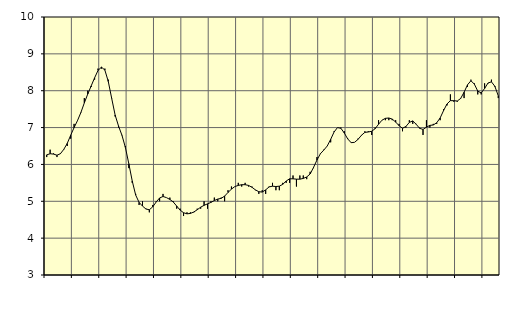
| Category | Piggar | Byggverksamhet, SNI 41-43 |
|---|---|---|
| nan | 6.2 | 6.26 |
| 87.0 | 6.4 | 6.29 |
| 87.0 | 6.3 | 6.28 |
| 87.0 | 6.2 | 6.25 |
| nan | 6.3 | 6.29 |
| 88.0 | 6.4 | 6.41 |
| 88.0 | 6.5 | 6.57 |
| 88.0 | 6.7 | 6.79 |
| nan | 7.1 | 7 |
| 89.0 | 7.2 | 7.19 |
| 89.0 | 7.4 | 7.41 |
| 89.0 | 7.8 | 7.67 |
| nan | 8 | 7.91 |
| 90.0 | 8.1 | 8.13 |
| 90.0 | 8.3 | 8.35 |
| 90.0 | 8.6 | 8.55 |
| nan | 8.6 | 8.64 |
| 91.0 | 8.6 | 8.56 |
| 91.0 | 8.3 | 8.25 |
| 91.0 | 7.8 | 7.79 |
| nan | 7.3 | 7.34 |
| 92.0 | 7 | 7.04 |
| 92.0 | 6.8 | 6.79 |
| 92.0 | 6.5 | 6.46 |
| nan | 5.9 | 6.02 |
| 93.0 | 5.5 | 5.55 |
| 93.0 | 5.2 | 5.17 |
| 93.0 | 4.9 | 4.97 |
| nan | 5 | 4.87 |
| 94.0 | 4.8 | 4.79 |
| 94.0 | 4.7 | 4.77 |
| 94.0 | 4.9 | 4.85 |
| nan | 5 | 4.98 |
| 95.0 | 5 | 5.09 |
| 95.0 | 5.2 | 5.13 |
| 95.0 | 5.1 | 5.1 |
| nan | 5.1 | 5.05 |
| 96.0 | 5 | 4.98 |
| 96.0 | 4.8 | 4.87 |
| 96.0 | 4.8 | 4.76 |
| nan | 4.6 | 4.69 |
| 97.0 | 4.7 | 4.66 |
| 97.0 | 4.7 | 4.67 |
| 97.0 | 4.7 | 4.71 |
| nan | 4.8 | 4.77 |
| 98.0 | 4.8 | 4.84 |
| 98.0 | 5 | 4.89 |
| 98.0 | 4.8 | 4.93 |
| nan | 5 | 4.97 |
| 99.0 | 5.1 | 5.02 |
| 99.0 | 5 | 5.06 |
| 99.0 | 5.1 | 5.08 |
| nan | 5 | 5.14 |
| 0.0 | 5.3 | 5.24 |
| 0.0 | 5.4 | 5.33 |
| 0.0 | 5.4 | 5.4 |
| nan | 5.5 | 5.43 |
| 1.0 | 5.4 | 5.45 |
| 1.0 | 5.5 | 5.45 |
| 1.0 | 5.4 | 5.43 |
| nan | 5.4 | 5.38 |
| 2.0 | 5.3 | 5.31 |
| 2.0 | 5.2 | 5.26 |
| 2.0 | 5.3 | 5.25 |
| nan | 5.2 | 5.31 |
| 3.0 | 5.4 | 5.39 |
| 3.0 | 5.5 | 5.41 |
| 3.0 | 5.3 | 5.4 |
| nan | 5.3 | 5.41 |
| 4.0 | 5.5 | 5.46 |
| 4.0 | 5.5 | 5.55 |
| 4.0 | 5.5 | 5.61 |
| nan | 5.7 | 5.61 |
| 5.0 | 5.4 | 5.6 |
| 5.0 | 5.7 | 5.6 |
| 5.0 | 5.7 | 5.62 |
| nan | 5.6 | 5.66 |
| 6.0 | 5.8 | 5.74 |
| 6.0 | 5.9 | 5.92 |
| 6.0 | 6.2 | 6.12 |
| nan | 6.3 | 6.29 |
| 7.0 | 6.4 | 6.39 |
| 7.0 | 6.5 | 6.5 |
| 7.0 | 6.6 | 6.68 |
| nan | 6.9 | 6.88 |
| 8.0 | 7 | 7 |
| 8.0 | 7 | 6.98 |
| 8.0 | 6.9 | 6.85 |
| nan | 6.7 | 6.69 |
| 9.0 | 6.6 | 6.59 |
| 9.0 | 6.6 | 6.6 |
| 9.0 | 6.7 | 6.68 |
| nan | 6.8 | 6.79 |
| 10.0 | 6.9 | 6.87 |
| 10.0 | 6.9 | 6.88 |
| 10.0 | 6.8 | 6.9 |
| nan | 7 | 6.97 |
| 11.0 | 7.2 | 7.09 |
| 11.0 | 7.2 | 7.2 |
| 11.0 | 7.2 | 7.25 |
| nan | 7.2 | 7.26 |
| 12.0 | 7.2 | 7.23 |
| 12.0 | 7.2 | 7.15 |
| 12.0 | 7.1 | 7.05 |
| nan | 6.9 | 6.98 |
| 13.0 | 7 | 7.03 |
| 13.0 | 7.2 | 7.14 |
| 13.0 | 7.1 | 7.18 |
| nan | 7.1 | 7.09 |
| 14.0 | 7 | 6.98 |
| 14.0 | 6.8 | 6.95 |
| 14.0 | 7.2 | 7.01 |
| nan | 7 | 7.06 |
| 15.0 | 7.1 | 7.07 |
| 15.0 | 7.1 | 7.13 |
| 15.0 | 7.2 | 7.26 |
| nan | 7.5 | 7.46 |
| 16.0 | 7.6 | 7.64 |
| 16.0 | 7.9 | 7.73 |
| 16.0 | 7.7 | 7.73 |
| nan | 7.7 | 7.72 |
| 17.0 | 7.8 | 7.79 |
| 17.0 | 7.8 | 7.96 |
| 17.0 | 8.1 | 8.16 |
| nan | 8.3 | 8.27 |
| 18.0 | 8.2 | 8.18 |
| 18.0 | 7.9 | 7.99 |
| 18.0 | 7.9 | 7.94 |
| nan | 8.2 | 8.06 |
| 19.0 | 8.2 | 8.21 |
| 19.0 | 8.3 | 8.24 |
| 19.0 | 8.1 | 8.12 |
| nan | 7.8 | 7.86 |